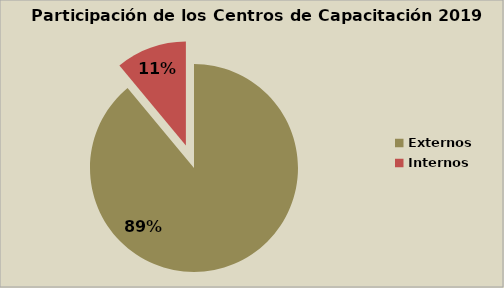
| Category | Series 0 |
|---|---|
| Externos | 88.966 |
| Internos | 11.034 |